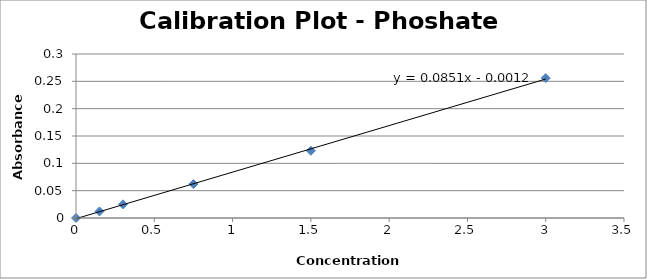
| Category | Series 0 |
|---|---|
| 0.0 | 0 |
| 0.15 | 0.012 |
| 0.3 | 0.025 |
| 0.75 | 0.062 |
| 1.5 | 0.123 |
| 3.0 | 0.256 |